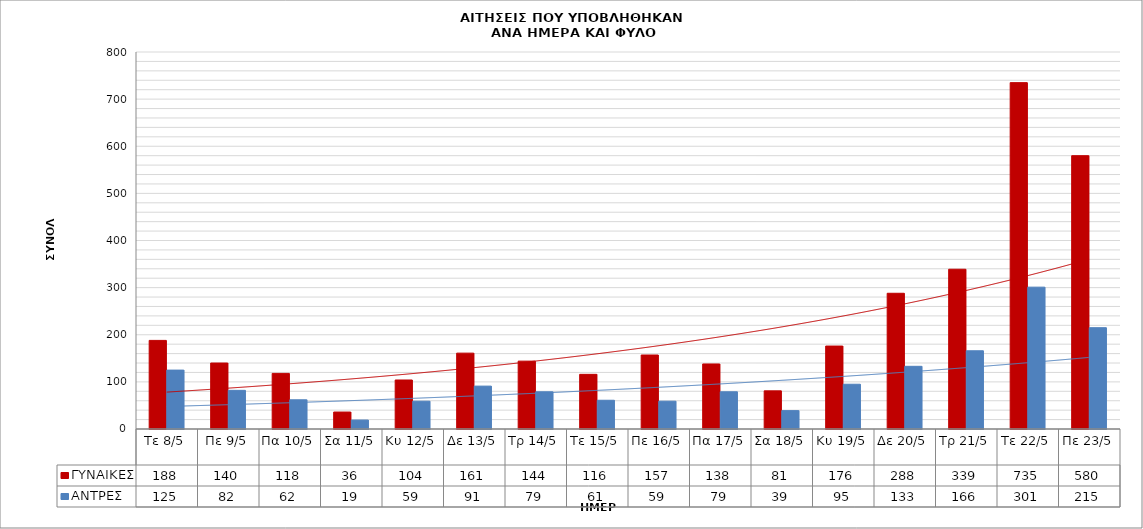
| Category | ΓΥΝΑΙΚΕΣ | ΑΝΤΡΕΣ |
|---|---|---|
| Τε 8/5 | 188 | 125 |
| Πε 9/5 | 140 | 82 |
| Πα 10/5 | 118 | 62 |
| Σα 11/5 | 36 | 19 |
| Κυ 12/5 | 104 | 59 |
| Δε 13/5 | 161 | 91 |
| Τρ 14/5 | 144 | 79 |
| Τε 15/5 | 116 | 61 |
| Πε 16/5 | 157 | 59 |
| Πα 17/5 | 138 | 79 |
| Σα 18/5 | 81 | 39 |
| Κυ 19/5 | 176 | 95 |
| Δε 20/5 | 288 | 133 |
| Τρ 21/5 | 339 | 166 |
| Τε 22/5 | 735 | 301 |
| Πε 23/5 | 580 | 215 |